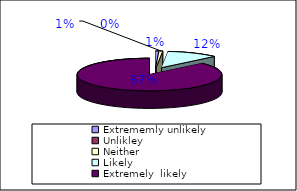
| Category | Would you recommend us to your friends and family |
|---|---|
| Extrememly unlikely | 1 |
| Unlikley | 0 |
| Neither | 1 |
| Likely | 16 |
| Extremely  likely  | 121 |